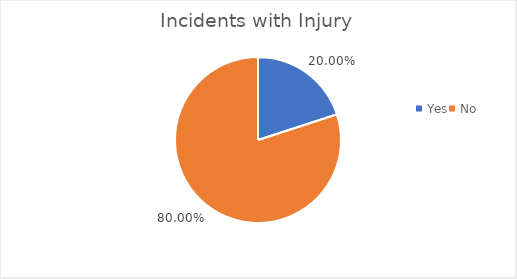
| Category | Series 0 |
|---|---|
| Yes | 0.2 |
| No | 0.8 |